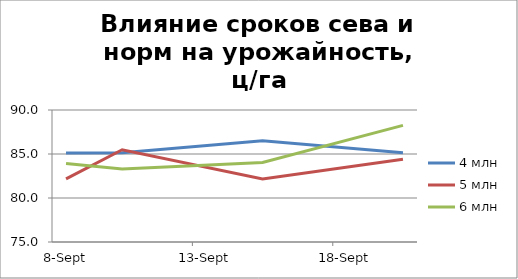
| Category | 4 млн | 5 млн | 6 млн |
|---|---|---|---|
| 2016-09-08 | 85.117 | 82.167 | 83.933 |
| 2016-09-10 | 85.135 | 85.486 | 83.308 |
| 2016-09-15 | 86.513 | 82.167 | 84.029 |
| 2016-09-20 | 85.135 | 84.397 | 88.247 |